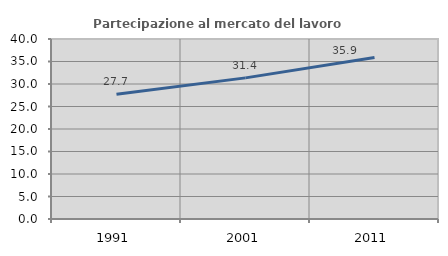
| Category | Partecipazione al mercato del lavoro  femminile |
|---|---|
| 1991.0 | 27.731 |
| 2001.0 | 31.361 |
| 2011.0 | 35.895 |